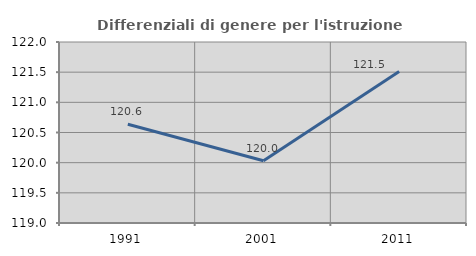
| Category | Differenziali di genere per l'istruzione superiore |
|---|---|
| 1991.0 | 120.636 |
| 2001.0 | 120.033 |
| 2011.0 | 121.512 |